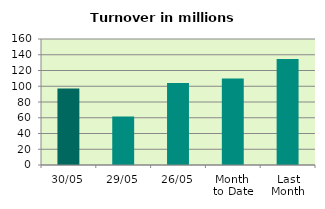
| Category | Series 0 |
|---|---|
| 30/05 | 97.069 |
| 29/05 | 61.442 |
| 26/05 | 104.184 |
| Month 
to Date | 109.734 |
| Last
Month | 134.694 |